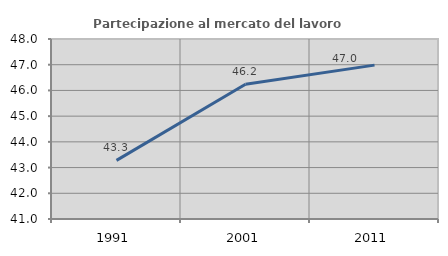
| Category | Partecipazione al mercato del lavoro  femminile |
|---|---|
| 1991.0 | 43.279 |
| 2001.0 | 46.24 |
| 2011.0 | 46.985 |